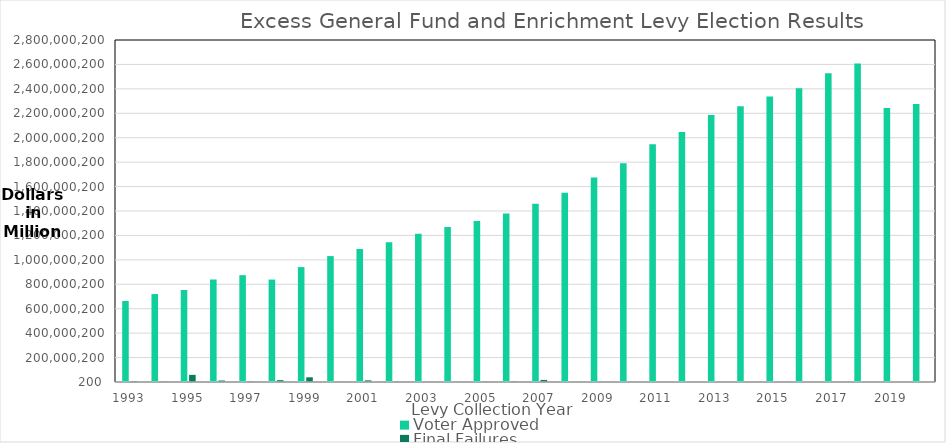
| Category | Voter Approved | Final Failures |
|---|---|---|
| 1993 | 663306099 | 7368320 |
| 1994 | 719954685 | 3633044 |
| 1995 | 753041982 | 58324310 |
| 1996 | 839318107 | 12089175 |
| 1997 | 874789668 | 3765443 |
| 1998 | 838604584 | 15047453 |
| 1999 | 940765937 | 38481902 |
| 2000 | 1030873759 | 1268399 |
| 2001 | 1088088126 | 13438599 |
| 2002 | 1143919081 | 3533559 |
| 2003 | 1212816864 | 1907738 |
| 2004 | 1268819341 | 482851 |
| 2005 | 1317841524 | 3338000 |
| 2006 | 1380248875 | 3947759 |
| 2007 | 1459700998 | 16940636 |
| 2008 | 1549670919 | 225000 |
| 2009 | 1674487111 | 347952 |
| 2010 | 1791463918 | 349181 |
| 2011 | 1945703236 | 0 |
| 2012 | 2046703841 | 245000 |
| 2013 | 2184995410 | 838000 |
| 2014 | 2257657771 | 0 |
| 2015 | 2338026390 | 117000 |
| 2016 | 2405746819 | 117000 |
| 2017 | 2527706168 | 0 |
| 2018 | 2606634102 | 0 |
| 2019 | 2243795589 | 0 |
| 2020 | 2276315760 | 0 |